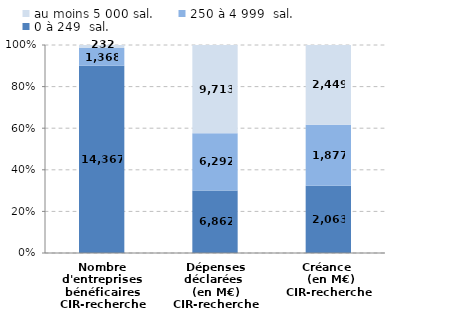
| Category | 0 à 249  sal. | 250 à 4 999  sal. | au moins 5 000 sal. |
|---|---|---|---|
| Nombre d'entreprises bénéficaires
CIR-recherche | 14367 | 1368 | 232 |
| Dépenses déclarées 
(en M€)
CIR-recherche | 6861.95 | 6292.1 | 9712.83 |
| Créance 
 (en M€)
CIR-recherche | 2062.84 | 1876.9 | 2448.65 |